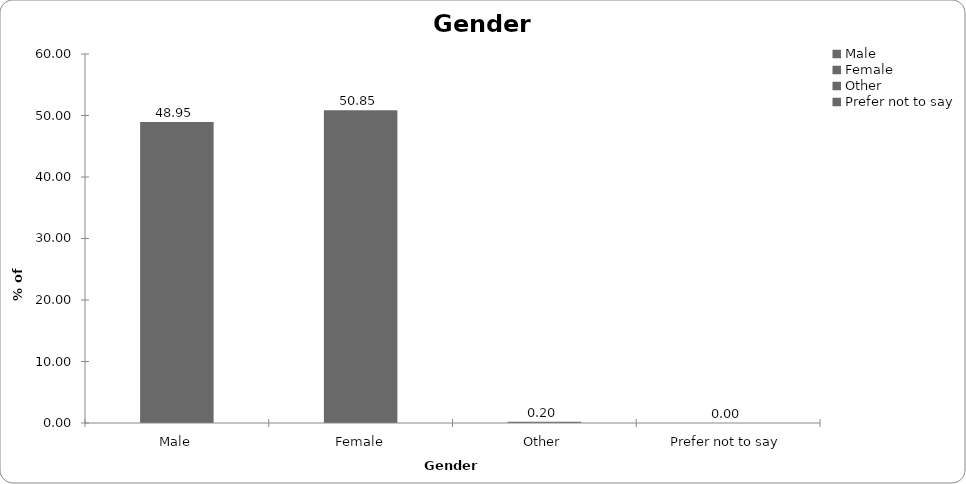
| Category | Series 0 |
|---|---|
| Male | 48.951 |
| Female | 50.849 |
| Other | 0.2 |
| Prefer not to say | 0 |